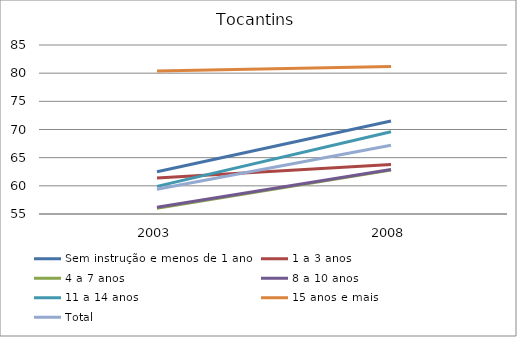
| Category | Sem instrução e menos de 1 ano | 1 a 3 anos | 4 a 7 anos | 8 a 10 anos | 11 a 14 anos | 15 anos e mais | Total |
|---|---|---|---|---|---|---|---|
| 2003.0 | 62.5 | 61.4 | 56 | 56.2 | 59.9 | 80.4 | 59.4 |
| 2008.0 | 71.5 | 63.8 | 62.8 | 62.9 | 69.6 | 81.2 | 67.2 |